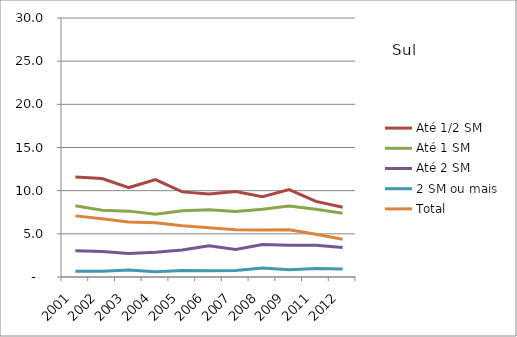
| Category | Até 1/2 SM | Até 1 SM | Até 2 SM | 2 SM ou mais | Total |
|---|---|---|---|---|---|
| 2001.0 | 11.59 | 8.25 | 3.04 | 0.68 | 7.08 |
| 2002.0 | 11.4 | 7.74 | 2.94 | 0.66 | 6.74 |
| 2003.0 | 10.36 | 7.63 | 2.71 | 0.81 | 6.38 |
| 2004.0 | 11.29 | 7.27 | 2.86 | 0.6 | 6.28 |
| 2005.0 | 9.86 | 7.68 | 3.13 | 0.74 | 5.93 |
| 2006.0 | 9.61 | 7.79 | 3.61 | 0.71 | 5.7 |
| 2007.0 | 9.91 | 7.58 | 3.2 | 0.74 | 5.47 |
| 2008.0 | 9.29 | 7.85 | 3.77 | 1.04 | 5.45 |
| 2009.0 | 10.13 | 8.21 | 3.68 | 0.85 | 5.47 |
| 2011.0 | 8.76 | 7.85 | 3.69 | 0.98 | 4.94 |
| 2012.0 | 8.07 | 7.39 | 3.43 | 0.92 | 4.38 |